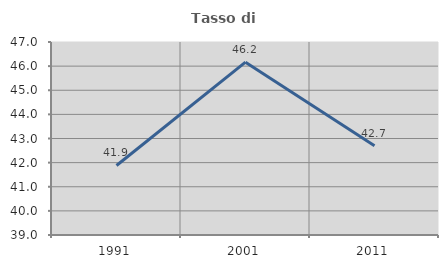
| Category | Tasso di occupazione   |
|---|---|
| 1991.0 | 41.881 |
| 2001.0 | 46.165 |
| 2011.0 | 42.704 |